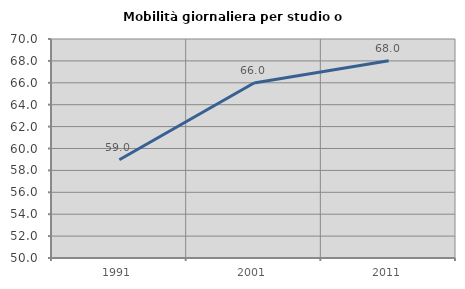
| Category | Mobilità giornaliera per studio o lavoro |
|---|---|
| 1991.0 | 58.977 |
| 2001.0 | 65.988 |
| 2011.0 | 68.018 |